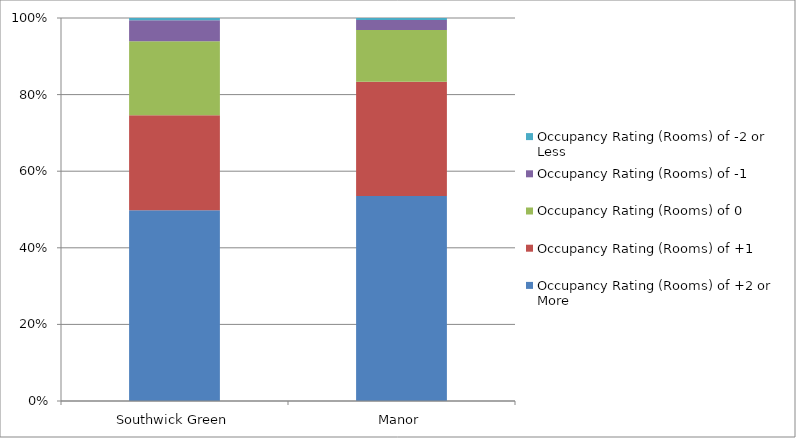
| Category | Occupancy Rating (Rooms) of +2 or More | Occupancy Rating (Rooms) of +1 | Occupancy Rating (Rooms) of 0 | Occupancy Rating (Rooms) of -1 | Occupancy Rating (Rooms) of -2 or Less |
|---|---|---|---|---|---|
| Southwick Green | 983 | 490 | 382 | 109 | 11 |
| Manor | 902 | 502 | 228 | 44 | 9 |